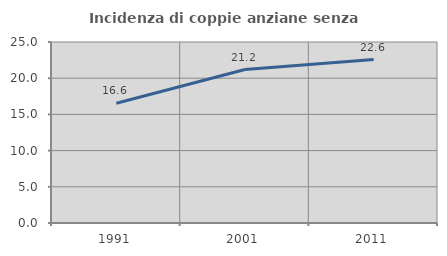
| Category | Incidenza di coppie anziane senza figli  |
|---|---|
| 1991.0 | 16.55 |
| 2001.0 | 21.194 |
| 2011.0 | 22.581 |